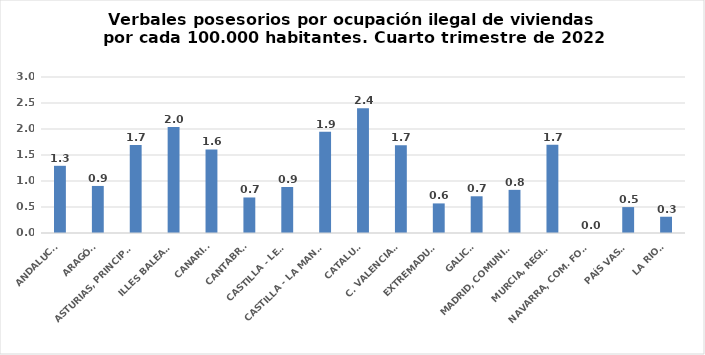
| Category | Series 0 |
|---|---|
| ANDALUCÍA | 1.292 |
| ARAGÓN | 0.905 |
| ASTURIAS, PRINCIPADO | 1.692 |
| ILLES BALEARS | 2.04 |
| CANARIAS | 1.607 |
| CANTABRIA | 0.683 |
| CASTILLA - LEÓN | 0.885 |
| CASTILLA - LA MANCHA | 1.948 |
| CATALUÑA | 2.4 |
| C. VALENCIANA | 1.687 |
| EXTREMADURA | 0.569 |
| GALICIA | 0.706 |
| MADRID, COMUNIDAD | 0.83 |
| MURCIA, REGIÓN | 1.697 |
| NAVARRA, COM. FORAL | 0 |
| PAÍS VASCO | 0.498 |
| LA RIOJA | 0.313 |